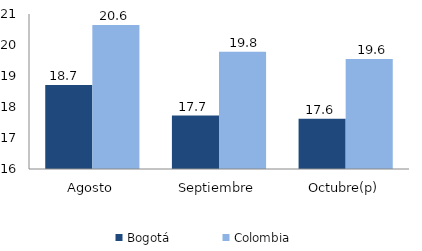
| Category | Bogotá | Colombia |
|---|---|---|
| Agosto | 18.714 | 20.648 |
| Septiembre | 17.724 | 19.786 |
| Octubre(p) | 17.622 | 19.551 |